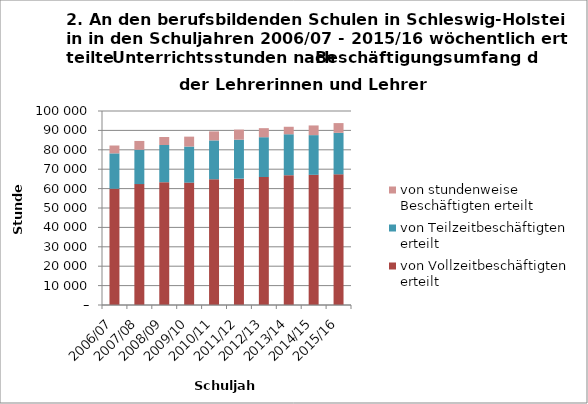
| Category | von Vollzeitbeschäftigten erteilt | von Teilzeitbeschäftigten erteilt | von stundenweise Beschäftigten erteilt |
|---|---|---|---|
| 2006/07 | 59945 | 18218 | 4049 |
| 2007/08 | 62310 | 17717 | 4535 |
| 2008/09 | 63318 | 19143 | 4127 |
| 2009/10 | 63082 | 18601 | 5100 |
| 2010/11 | 64821 | 20032 | 4645 |
| 2011/12 | 65119 | 20107 | 5192 |
| 2012/13 | 65972 | 20520 | 4659 |
| 2013/14 | 66913 | 21100 | 3862 |
| 2014/15 | 67101.5 | 20464.1 | 4987.2 |
| 2015/16 | 67369.2 | 21390.4 | 5010.3 |